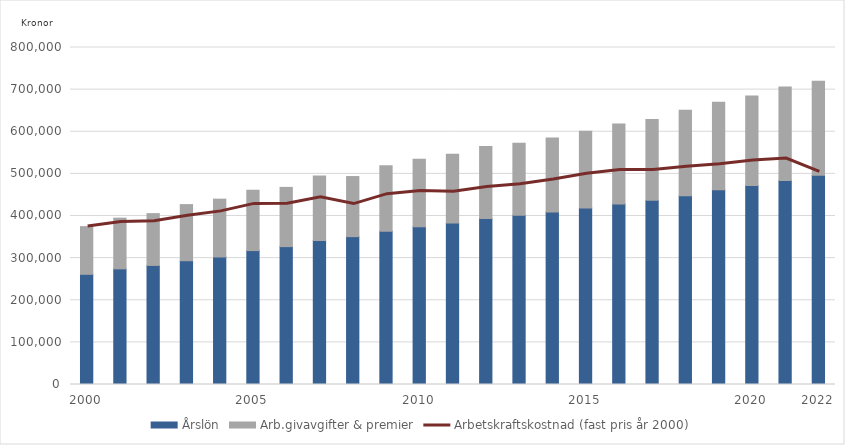
| Category | Årslön | Arb.givavgifter & premier |
|---|---|---|
| 2000.0 | 261608.376 | 113213.435 |
| nan | 274527.99 | 120401.42 |
| nan | 282659.142 | 122977.216 |
| nan | 293880.525 | 133192.696 |
| nan | 302723.131 | 137257.657 |
| 2005.0 | 317920.823 | 143221.146 |
| nan | 327333.09 | 140591.837 |
| nan | 341668.488 | 153376.399 |
| nan | 351035.46 | 142618.322 |
| nan | 363984.842 | 155294.492 |
| 2010.0 | 374398.596 | 160188.999 |
| nan | 383196.142 | 163603.856 |
| nan | 394061.432 | 170636.875 |
| nan | 401570.614 | 171020.914 |
| nan | 409521.057 | 175830.093 |
| 2015.0 | 418995.784 | 182381.989 |
| nan | 428591.045 | 189634.705 |
| nan | 437312.66 | 191831.13 |
| nan | 448349.589 | 202598.967 |
| nan | 462352.391 | 207907.122 |
| 2020.0 | 472314.857 | 212502.356 |
| nan | 484225.514 | 221728.154 |
| 2022.0 | 496943.974 | 222807.164 |